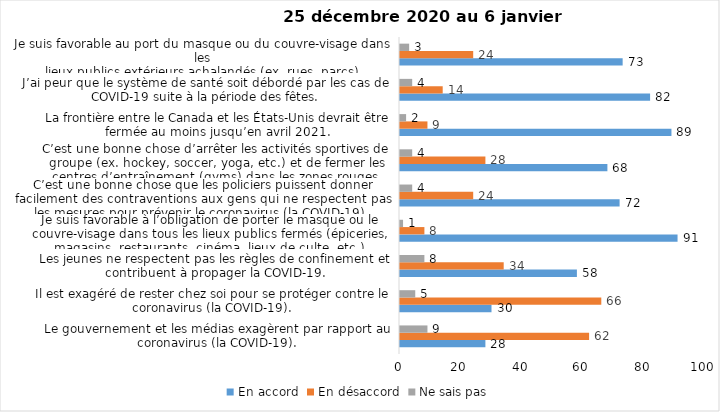
| Category | En accord | En désaccord | Ne sais pas |
|---|---|---|---|
| Le gouvernement et les médias exagèrent par rapport au coronavirus (la COVID-19). | 28 | 62 | 9 |
| Il est exagéré de rester chez soi pour se protéger contre le coronavirus (la COVID-19). | 30 | 66 | 5 |
| Les jeunes ne respectent pas les règles de confinement et contribuent à propager la COVID-19. | 58 | 34 | 8 |
| Je suis favorable à l’obligation de porter le masque ou le couvre-visage dans tous les lieux publics fermés (épiceries, magasins, restaurants, cinéma, lieux de culte, etc.). | 91 | 8 | 1 |
| C’est une bonne chose que les policiers puissent donner facilement des contraventions aux gens qui ne respectent pas les mesures pour prévenir le coronavirus (la COVID-19). | 72 | 24 | 4 |
| C’est une bonne chose d’arrêter les activités sportives de groupe (ex. hockey, soccer, yoga, etc.) et de fermer les centres d’entraînement (gyms) dans les zones rouges. | 68 | 28 | 4 |
| La frontière entre le Canada et les États-Unis devrait être fermée au moins jusqu’en avril 2021. | 89 | 9 | 2 |
| J’ai peur que le système de santé soit débordé par les cas de COVID-19 suite à la période des fêtes. | 82 | 14 | 4 |
| Je suis favorable au port du masque ou du couvre-visage dans les
lieux publics extérieurs achalandés (ex. rues, parcs) | 73 | 24 | 3 |